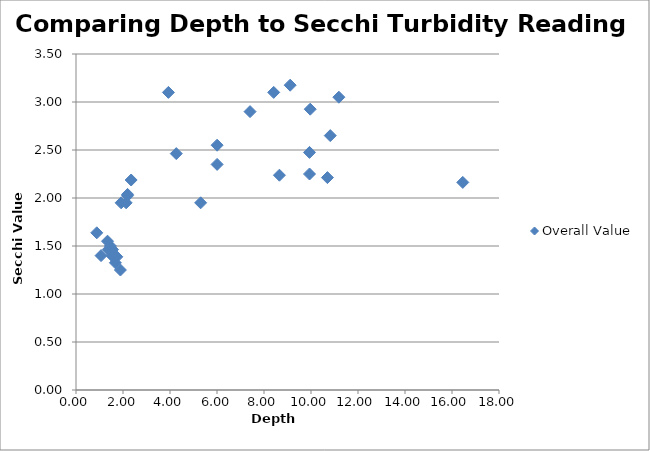
| Category | Overall Value |
|---|---|
| 1.88976 | 1.25 |
| 1.6764 | 1.325 |
| 1.73736 | 1.388 |
| 1.524 | 1.4 |
| 1.0668 | 1.4 |
| 1.3716 | 1.462 |
| 1.55448 | 1.462 |
| 1.46304 | 1.5 |
| 1.34112 | 1.55 |
| 0.88392 | 1.638 |
| 5.30352 | 1.95 |
| 1.92024 | 1.95 |
| 2.1336 | 1.95 |
| 2.19456 | 2.025 |
| 2.19456 | 2.038 |
| 16.4592 | 2.162 |
| 2.34696 | 2.188 |
| 10.69848 | 2.212 |
| 8.65632 | 2.238 |
| 9.93648 | 2.25 |
| 6.00456 | 2.35 |
| 4.2672 | 2.462 |
| 9.93648 | 2.475 |
| 6.00456 | 2.55 |
| 10.8204 | 2.65 |
| 7.40664 | 2.9 |
| 9.966960000000002 | 2.925 |
| 11.18616 | 3.05 |
| 3.93192 | 3.1 |
| 8.41248 | 3.1 |
| 9.11352 | 3.175 |